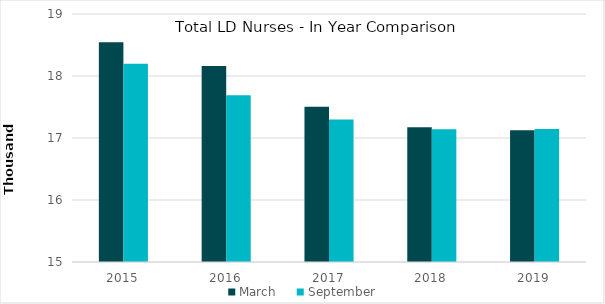
| Category | March | September |
|---|---|---|
| 2015.0 | 18546 | 18199 |
| 2016.0 | 18163 | 17690 |
| 2017.0 | 17503 | 17298 |
| 2018.0 | 17174 | 17142 |
| 2019.0 | 17125 | 17146 |